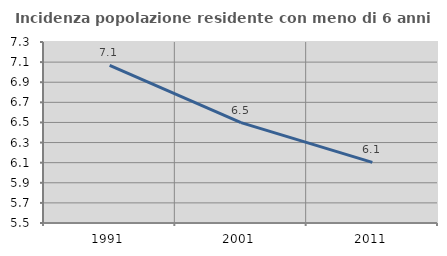
| Category | Incidenza popolazione residente con meno di 6 anni |
|---|---|
| 1991.0 | 7.068 |
| 2001.0 | 6.499 |
| 2011.0 | 6.103 |